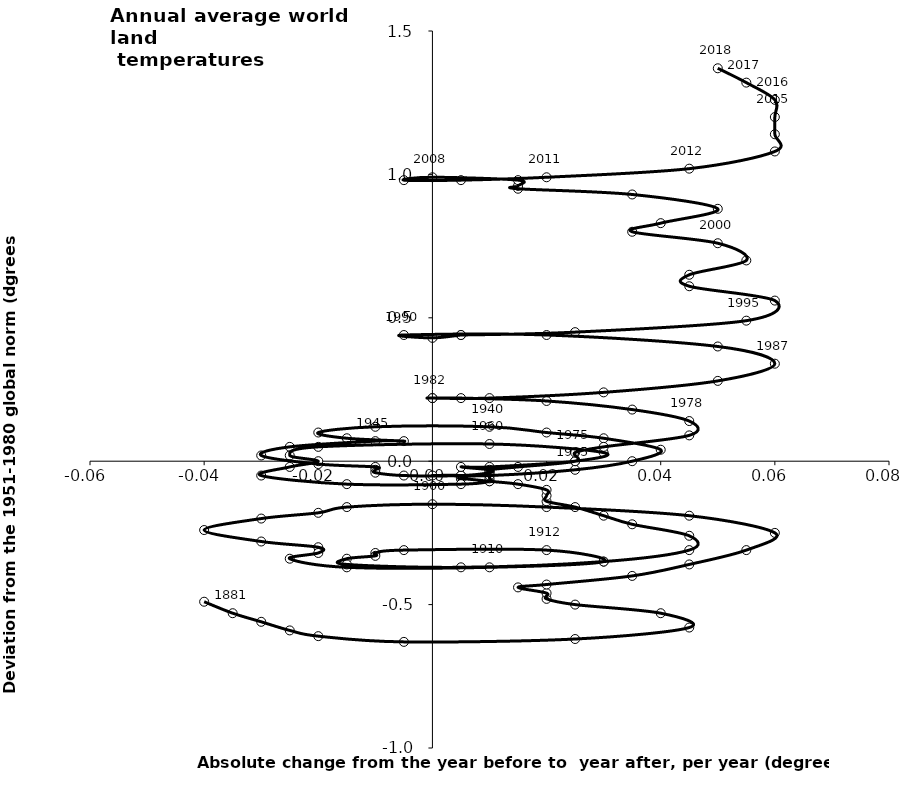
| Category | Series 0 |
|---|---|
| -0.040000000000000036 | -0.49 |
| -0.03500000000000003 | -0.53 |
| -0.02999999999999997 | -0.56 |
| -0.024999999999999967 | -0.59 |
| -0.020000000000000018 | -0.61 |
| -0.0050000000000000044 | -0.63 |
| 0.025000000000000022 | -0.62 |
| 0.044999999999999984 | -0.58 |
| 0.03999999999999998 | -0.53 |
| 0.025000000000000022 | -0.5 |
| 0.01999999999999999 | -0.48 |
| 0.01999999999999999 | -0.46 |
| 0.015000000000000013 | -0.44 |
| 0.01999999999999999 | -0.43 |
| 0.035 | -0.4 |
| 0.04500000000000001 | -0.36 |
| 0.05499999999999999 | -0.31 |
| 0.06 | -0.25 |
| 0.045 | -0.19 |
| 0.020000000000000004 | -0.16 |
| 0.0 | -0.15 |
| -0.015 | -0.16 |
| -0.020000000000000004 | -0.18 |
| -0.03 | -0.2 |
| -0.04000000000000001 | -0.24 |
| -0.03 | -0.28 |
| -0.01999999999999999 | -0.3 |
| -0.020000000000000018 | -0.32 |
| -0.024999999999999994 | -0.34 |
| -0.014999999999999986 | -0.37 |
| 0.010000000000000009 | -0.37 |
| 0.03 | -0.35 |
| 0.01999999999999999 | -0.31 |
| -0.0050000000000000044 | -0.31 |
| -0.010000000000000009 | -0.32 |
| -0.010000000000000009 | -0.33 |
| -0.014999999999999986 | -0.34 |
| -0.014999999999999986 | -0.36 |
| 0.0050000000000000044 | -0.37 |
| 0.03 | -0.35 |
| 0.044999999999999984 | -0.31 |
| 0.045 | -0.26 |
| 0.035 | -0.22 |
| 0.03 | -0.19 |
| 0.024999999999999994 | -0.16 |
| 0.020000000000000004 | -0.14 |
| 0.020000000000000004 | -0.12 |
| 0.019999999999999997 | -0.1 |
| 0.015 | -0.08 |
| 0.010000000000000002 | -0.07 |
| 0.0050000000000000044 | -0.06 |
| 0.0049999999999999975 | -0.06 |
| 0.0049999999999999975 | -0.05 |
| 0.0 | -0.05 |
| 0.010000000000000002 | -0.05 |
| 0.025 | -0.03 |
| 0.035 | 0 |
| 0.04 | 0.04 |
| 0.030000000000000002 | 0.08 |
| 0.019999999999999997 | 0.1 |
| 0.009999999999999995 | 0.12 |
| -0.009999999999999995 | 0.12 |
| -0.019999999999999997 | 0.1 |
| -0.015 | 0.08 |
| -0.0049999999999999975 | 0.07 |
| -0.010000000000000002 | 0.07 |
| -0.025 | 0.05 |
| -0.030000000000000002 | 0.02 |
| -0.02 | -0.01 |
| -0.009999999999999998 | -0.02 |
| -0.01 | -0.03 |
| -0.010000000000000002 | -0.04 |
| -0.005000000000000001 | -0.05 |
| 0.005000000000000001 | -0.05 |
| 0.010000000000000002 | -0.04 |
| 0.01 | -0.03 |
| 0.004999999999999999 | -0.02 |
| 0.01 | -0.02 |
| 0.025 | 0 |
| 0.03 | 0.03 |
| 0.010000000000000002 | 0.06 |
| -0.019999999999999997 | 0.05 |
| -0.025 | 0.02 |
| -0.02 | 0 |
| -0.025 | -0.02 |
| -0.03 | -0.05 |
| -0.015 | -0.08 |
| 0.0049999999999999975 | -0.08 |
| 0.010000000000000002 | -0.07 |
| 0.010000000000000002 | -0.06 |
| 0.009999999999999998 | -0.05 |
| 0.010000000000000002 | -0.04 |
| 0.01 | -0.03 |
| 0.015 | -0.02 |
| 0.025 | 0 |
| 0.025 | 0.03 |
| 0.03 | 0.05 |
| 0.045000000000000005 | 0.09 |
| 0.045 | 0.14 |
| 0.03499999999999999 | 0.18 |
| 0.020000000000000004 | 0.21 |
| 0.0050000000000000044 | 0.22 |
| 0.0 | 0.22 |
| 0.0 | 0.22 |
| 0.009999999999999995 | 0.22 |
| 0.030000000000000013 | 0.24 |
| 0.05000000000000002 | 0.28 |
| 0.06 | 0.34 |
| 0.04999999999999999 | 0.4 |
| 0.01999999999999999 | 0.44 |
| -0.0050000000000000044 | 0.44 |
| 0.0 | 0.43 |
| 0.0050000000000000044 | 0.44 |
| 0.0050000000000000044 | 0.44 |
| 0.024999999999999994 | 0.45 |
| 0.05500000000000002 | 0.49 |
| 0.06 | 0.56 |
| 0.044999999999999984 | 0.61 |
| 0.044999999999999984 | 0.65 |
| 0.05499999999999999 | 0.7 |
| 0.050000000000000044 | 0.76 |
| 0.034999999999999976 | 0.8 |
| 0.03999999999999998 | 0.83 |
| 0.050000000000000044 | 0.88 |
| 0.034999999999999976 | 0.93 |
| 0.014999999999999958 | 0.95 |
| 0.015000000000000013 | 0.96 |
| 0.015000000000000013 | 0.98 |
| 0.0 | 0.99 |
| -0.0050000000000000044 | 0.98 |
| 0.0050000000000000044 | 0.98 |
| 0.020000000000000018 | 0.99 |
| 0.04500000000000004 | 1.02 |
| 0.05999999999999994 | 1.08 |
| 0.05999999999999994 | 1.14 |
| 0.06000000000000005 | 1.2 |
| 0.06000000000000005 | 1.26 |
| 0.05500000000000005 | 1.32 |
| 0.050000000000000044 | 1.37 |